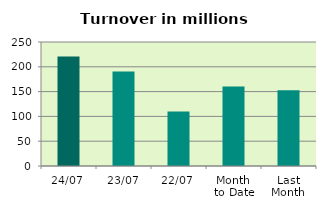
| Category | Series 0 |
|---|---|
| 24/07 | 220.872 |
| 23/07 | 190.29 |
| 22/07 | 109.987 |
| Month 
to Date | 160.359 |
| Last
Month | 152.535 |